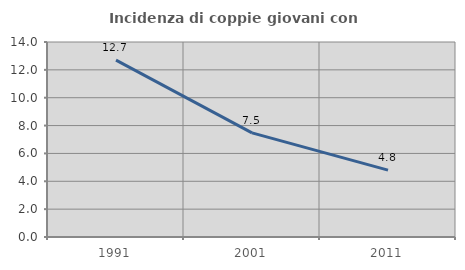
| Category | Incidenza di coppie giovani con figli |
|---|---|
| 1991.0 | 12.697 |
| 2001.0 | 7.478 |
| 2011.0 | 4.8 |